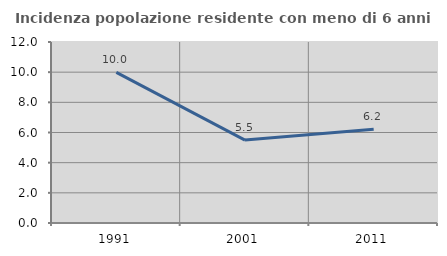
| Category | Incidenza popolazione residente con meno di 6 anni |
|---|---|
| 1991.0 | 9.983 |
| 2001.0 | 5.496 |
| 2011.0 | 6.214 |